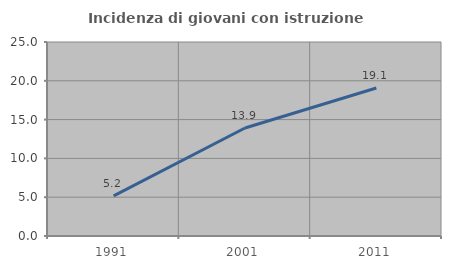
| Category | Incidenza di giovani con istruzione universitaria |
|---|---|
| 1991.0 | 5.176 |
| 2001.0 | 13.92 |
| 2011.0 | 19.078 |